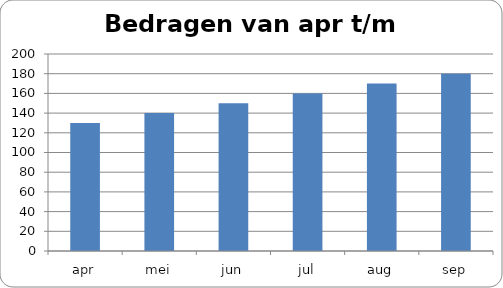
| Category | B |
|---|---|
| apr | 130 |
| mei | 140 |
| jun | 150 |
| jul | 160 |
| aug | 170 |
| sep | 180 |